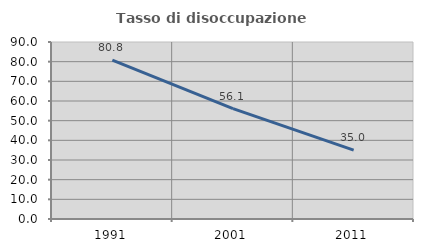
| Category | Tasso di disoccupazione giovanile  |
|---|---|
| 1991.0 | 80.8 |
| 2001.0 | 56.14 |
| 2011.0 | 35 |